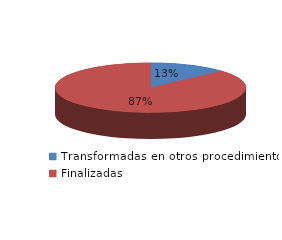
| Category | Series 0 |
|---|---|
| Transformadas en otros procedimientos | 2393 |
| Finalizadas | 15815 |